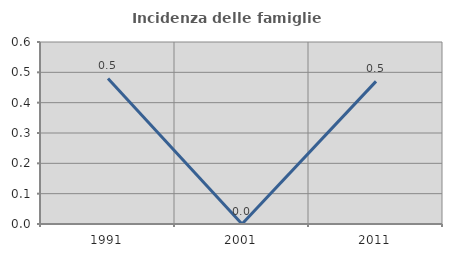
| Category | Incidenza delle famiglie numerose |
|---|---|
| 1991.0 | 0.48 |
| 2001.0 | 0 |
| 2011.0 | 0.47 |